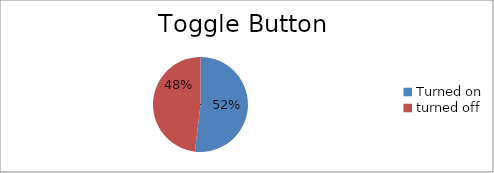
| Category | Toggle State |
|---|---|
| Turned on | 82 |
| turned off | 76 |